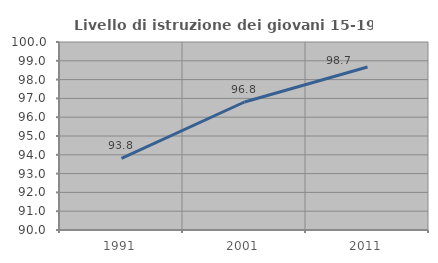
| Category | Livello di istruzione dei giovani 15-19 anni |
|---|---|
| 1991.0 | 93.805 |
| 2001.0 | 96.809 |
| 2011.0 | 98.667 |